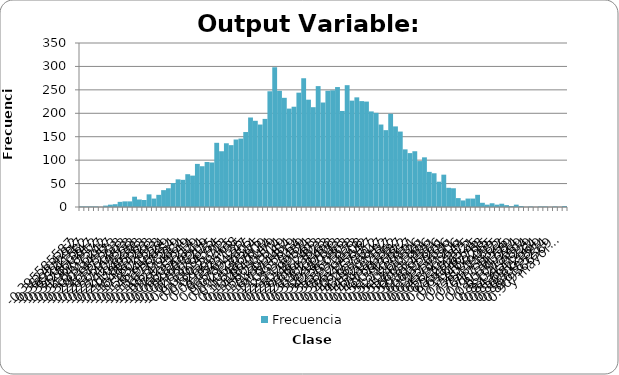
| Category | Frecuencia |
|---|---|
| -0,40 | 1 |
| -0,38 | 1 |
| -0,37 | 1 |
| -0,36 | 1 |
| -0,34 | 0 |
| -0,33 | 3 |
| -0,32 | 5 |
| -0,30 | 6 |
| -0,29 | 11 |
| -0,28 | 12 |
| -0,26 | 12 |
| -0,25 | 22 |
| -0,24 | 16 |
| -0,22 | 15 |
| -0,21 | 27 |
| -0,20 | 18 |
| -0,18 | 26 |
| -0,17 | 36 |
| -0,16 | 40 |
| -0,15 | 51 |
| -0,13 | 59 |
| -0,12 | 58 |
| -0,11 | 70 |
| -0,09 | 67 |
| -0,08 | 92 |
| -0,07 | 87 |
| -0,05 | 96 |
| -0,04 | 95 |
| -0,03 | 137 |
| -0,01 | 119 |
| 0,00 | 136 |
| 0,01 | 132 |
| 0,03 | 144 |
| 0,04 | 146 |
| 0,05 | 160 |
| 0,07 | 191 |
| 0,08 | 184 |
| 0,09 | 176 |
| 0,11 | 188 |
| 0,12 | 247 |
| 0,13 | 298 |
| 0,14 | 248 |
| 0,16 | 233 |
| 0,17 | 210 |
| 0,18 | 214 |
| 0,20 | 244 |
| 0,21 | 275 |
| 0,22 | 229 |
| 0,24 | 213 |
| 0,25 | 258 |
| 0,26 | 223 |
| 0,28 | 248 |
| 0,29 | 249 |
| 0,30 | 256 |
| 0,32 | 205 |
| 0,33 | 260 |
| 0,34 | 227 |
| 0,36 | 234 |
| 0,37 | 226 |
| 0,38 | 225 |
| 0,40 | 204 |
| 0,41 | 201 |
| 0,42 | 176 |
| 0,43 | 164 |
| 0,45 | 199 |
| 0,46 | 172 |
| 0,47 | 161 |
| 0,49 | 123 |
| 0,50 | 115 |
| 0,51 | 119 |
| 0,53 | 98 |
| 0,54 | 106 |
| 0,55 | 75 |
| 0,57 | 72 |
| 0,58 | 54 |
| 0,59 | 69 |
| 0,61 | 41 |
| 0,62 | 40 |
| 0,63 | 19 |
| 0,65 | 14 |
| 0,66 | 18 |
| 0,67 | 18 |
| 0,69 | 26 |
| 0,70 | 9 |
| 0,71 | 5 |
| 0,72 | 8 |
| 0,74 | 5 |
| 0,75 | 7 |
| 0,76 | 4 |
| 0,78 | 2 |
| 0,79 | 5 |
| 0,80 | 2 |
| 0,82 | 0 |
| 0,83 | 1 |
| 0,84 | 0 |
| 0,86 | 1 |
| 0,87 | 1 |
| 0,88 | 0 |
| 0,90 | 1 |
| 0,91 | 0 |
| y mayor... | 2 |